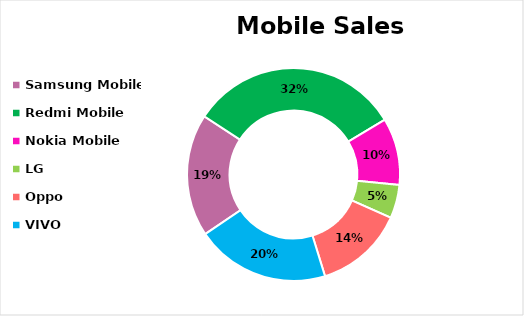
| Category | Units Sold |
|---|---|
| Samsung Mobile | 55000 |
| Redmi Mobile | 95000 |
| Nokia Mobile | 30000 |
| LG | 15000 |
| Oppo | 40000 |
| VIVO | 60000 |